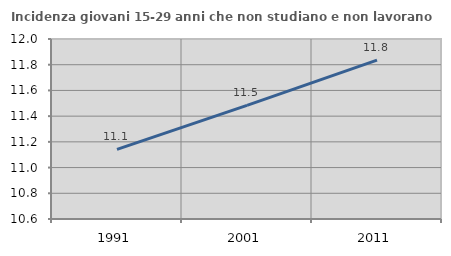
| Category | Incidenza giovani 15-29 anni che non studiano e non lavorano  |
|---|---|
| 1991.0 | 11.141 |
| 2001.0 | 11.484 |
| 2011.0 | 11.836 |